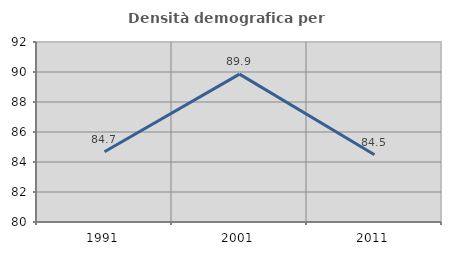
| Category | Densità demografica |
|---|---|
| 1991.0 | 84.686 |
| 2001.0 | 89.861 |
| 2011.0 | 84.487 |